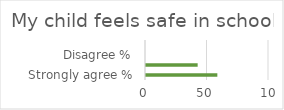
| Category | Series 1 |
|---|---|
| Strongly agree % | 58 |
| Agree % | 42 |
| Disagree % | 0 |
| Strongly disagree % | 0 |